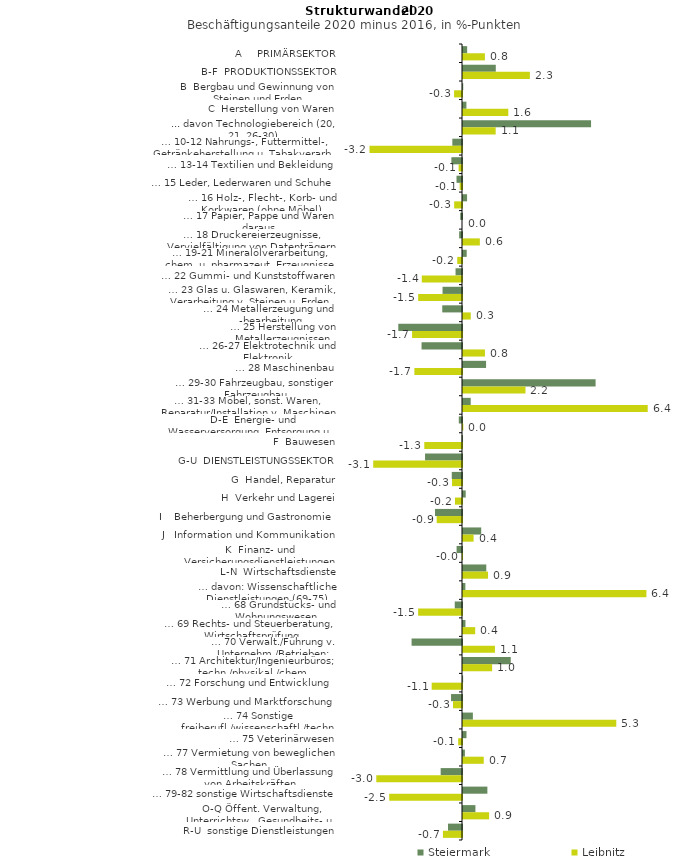
| Category | Steiermark | Leibnitz |
|---|---|---|
| A     PRIMÄRSEKTOR | 0.145 | 0.762 |
| B-F  PRODUKTIONSSEKTOR | 1.14 | 2.326 |
| B  Bergbau und Gewinnung von Steinen und Erden | 0.008 | -0.275 |
| C  Herstellung von Waren | 0.118 | 1.575 |
| ... davon Technologiebereich (20, 21, 26-30) | 4.454 | 1.137 |
| … 10-12 Nahrungs-, Futtermittel-, Getränkeherstellung u. Tabakverarb. | -0.336 | -3.217 |
| … 13-14 Textilien und Bekleidung | -0.37 | -0.118 |
| … 15 Leder, Lederwaren und Schuhe | -0.191 | -0.081 |
| … 16 Holz-, Flecht-, Korb- und Korkwaren (ohne Möbel)  | 0.142 | -0.272 |
| … 17 Papier, Pappe und Waren daraus  | -0.062 | 0 |
| … 18 Druckereierzeugnisse, Vervielfältigung von Datenträgern | -0.099 | 0.586 |
| … 19-21 Mineralölverarbeitung, chem. u. pharmazeut. Erzeugnisse | 0.129 | -0.165 |
| … 22 Gummi- und Kunststoffwaren | -0.225 | -1.399 |
| … 23 Glas u. Glaswaren, Keramik, Verarbeitung v. Steinen u. Erden  | -0.677 | -1.524 |
| … 24 Metallerzeugung und -bearbeitung | -0.687 | 0.269 |
| … 25 Herstellung von Metallerzeugnissen  | -2.216 | -1.737 |
| … 26-27 Elektrotechnik und Elektronik | -1.407 | 0.763 |
| … 28 Maschinenbau | 0.802 | -1.657 |
| … 29-30 Fahrzeugbau, sonstiger Fahrzeugbau | 4.612 | 2.174 |
| … 31-33 Möbel, sonst. Waren, Reparatur/Installation v. Maschinen | 0.268 | 6.425 |
| D-E  Energie- und Wasserversorgung, Entsorgung u. Rückgewinnung | -0.111 | 0.011 |
| F  Bauwesen | -0.015 | -1.311 |
| G-U  DIENSTLEISTUNGSSEKTOR | -1.285 | -3.088 |
| G  Handel, Reparatur | -0.356 | -0.346 |
| H  Verkehr und Lagerei | 0.094 | -0.245 |
| I    Beherbergung und Gastronomie | -0.938 | -0.881 |
| J   Information und Kommunikation | 0.633 | 0.369 |
| K  Finanz- und Versicherungsdienstleistungen | -0.188 | -0.006 |
| L-N  Wirtschaftsdienste | 0.81 | 0.871 |
| … davon: Wissenschaftliche Dienstleistungen (69-75) | 0.083 | 6.379 |
| … 68 Grundstücks- und Wohnungswesen  | -0.253 | -1.527 |
| … 69 Rechts- und Steuerberatung, Wirtschaftsprüfung | 0.086 | 0.425 |
| … 70 Verwalt./Führung v. Unternehm./Betrieben; Unternehmensberat. | -1.753 | 1.111 |
| … 71 Architektur/Ingenieurbüros; techn./physikal./chem. Untersuchung | 1.66 | 1.013 |
| … 72 Forschung und Entwicklung  | 0.004 | -1.055 |
| … 73 Werbung und Marktforschung | -0.382 | -0.313 |
| … 74 Sonstige freiberufl./wissenschaftl./techn. Tätigkeiten | 0.344 | 5.332 |
| … 75 Veterinärwesen | 0.121 | -0.133 |
| … 77 Vermietung von beweglichen Sachen  | 0.066 | 0.722 |
| … 78 Vermittlung und Überlassung von Arbeitskräften | -0.742 | -2.982 |
| … 79-82 sonstige Wirtschaftsdienste | 0.848 | -2.532 |
| O-Q Öffent. Verwaltung, Unterrichtsw., Gesundheits- u. Sozialwesen | 0.432 | 0.909 |
| R-U  sonstige Dienstleistungen | -0.488 | -0.664 |